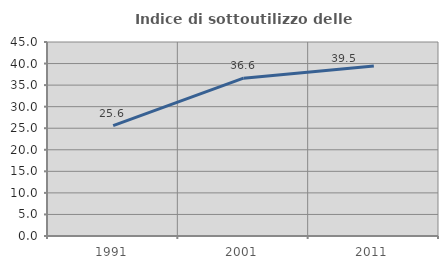
| Category | Indice di sottoutilizzo delle abitazioni  |
|---|---|
| 1991.0 | 25.592 |
| 2001.0 | 36.611 |
| 2011.0 | 39.458 |